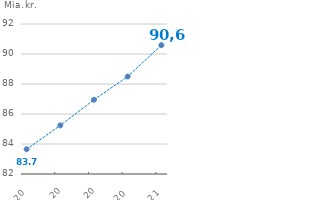
| Category | Realkreditgæld med sikkerhed i fritidshuse |
|---|---|
| 2020-03-01 | 83.65 |
| 2020-06-01 | 85.24 |
| 2020-09-01 | 86.95 |
| 2020-12-01 | 88.5 |
| 2021-03-01 | 90.59 |